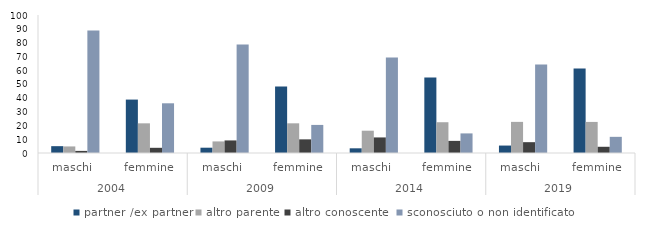
| Category | partner /ex partner | altro parente | altro conoscente  | sconosciuto o non identificato |
|---|---|---|---|---|
| 0 | 4.952 | 4.762 | 1.524 | 88.762 |
| 1 | 38.71 | 21.505 | 3.763 | 36.022 |
| 2 | 3.837 | 8.393 | 9.113 | 78.657 |
| 3 | 48.256 | 21.512 | 9.884 | 20.349 |
| 4 | 3.4 | 16.159 | 11.28 | 69.2 |
| 5 | 54.7 | 22.297 | 8.784 | 14.2 |
| 6 | 5.392 | 22.549 | 7.843 | 64.216 |
| 7 | 61.261 | 22.523 | 4.505 | 11.712 |